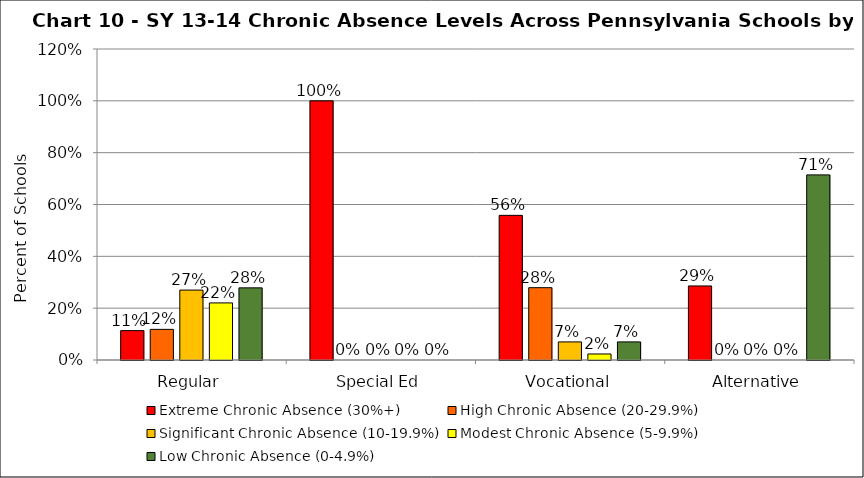
| Category | Extreme Chronic Absence (30%+) | High Chronic Absence (20-29.9%) | Significant Chronic Absence (10-19.9%) | Modest Chronic Absence (5-9.9%) | Low Chronic Absence (0-4.9%) |
|---|---|---|---|---|---|
| 0 | 0.113 | 0.118 | 0.27 | 0.22 | 0.278 |
| 1 | 1 | 0 | 0 | 0 | 0 |
| 2 | 0.558 | 0.279 | 0.07 | 0.023 | 0.07 |
| 3 | 0.286 | 0 | 0 | 0 | 0.714 |